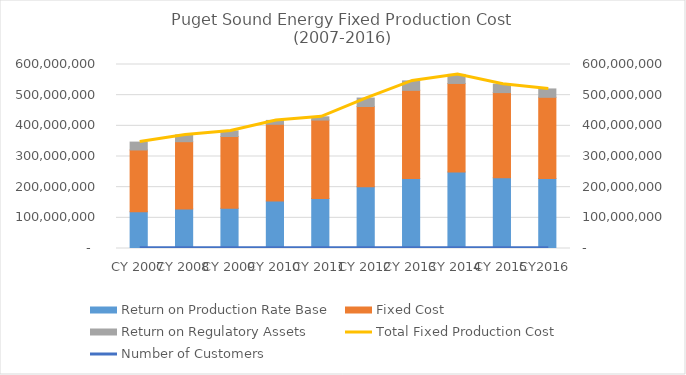
| Category | Return on Production Rate Base | Fixed Cost | Return on Regulatory Assets |
|---|---|---|---|
| CY 2007  | 120031396.059 | 201244735.929 | 25722356 |
| CY 2008 | 128696978.715 | 219579616.464 | 21948369 |
| CY 2009 | 131167986.935 | 234006526.25 | 18313667 |
| CY 2010 | 154630802.807 | 250434051.345 | 12583534 |
| CY 2011 | 163284388.889 | 255519792.93 | 10558905 |
| CY 2012 | 201247405.401 | 261810461.154 | 27564235 |
| CY 2013 | 228064496.439 | 287652761.778 | 30818934 |
| CY 2014 | 249742452.021 | 288450085.196 | 29441541 |
| CY 2015 | 230499656.003 | 277867216.764 | 27406842 |
| CY2016  | 228330552.572 | 264676296.202 | 27325813.917 |